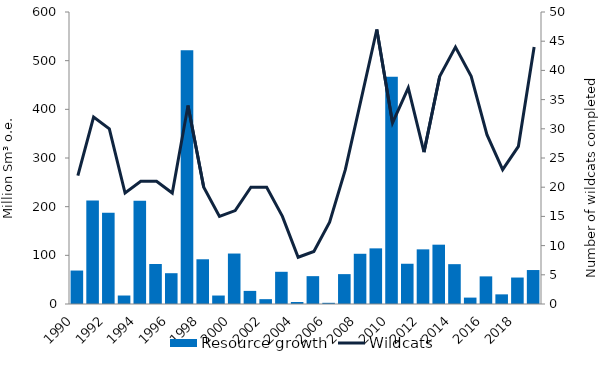
| Category | Resource growth |
|---|---|
| 1990.0 | 68.743 |
| 1991.0 | 212.682 |
| 1992.0 | 187.333 |
| 1993.0 | 17.43 |
| 1994.0 | 212.353 |
| 1995.0 | 82.151 |
| 1996.0 | 63.287 |
| 1997.0 | 521.34 |
| 1998.0 | 91.904 |
| 1999.0 | 17.404 |
| 2000.0 | 103.695 |
| 2001.0 | 26.947 |
| 2002.0 | 9.948 |
| 2003.0 | 66.174 |
| 2004.0 | 4.081 |
| 2005.0 | 57.22 |
| 2006.0 | 2.446 |
| 2007.0 | 61.389 |
| 2008.0 | 103.204 |
| 2009.0 | 114.324 |
| 2010.0 | 467.071 |
| 2011.0 | 82.712 |
| 2012.0 | 112.275 |
| 2013.0 | 121.889 |
| 2014.0 | 81.863 |
| 2015.0 | 13.145 |
| 2016.0 | 56.764 |
| 2017.0 | 19.807 |
| 2018.0 | 54.378 |
| 2019.0 | 69.791 |